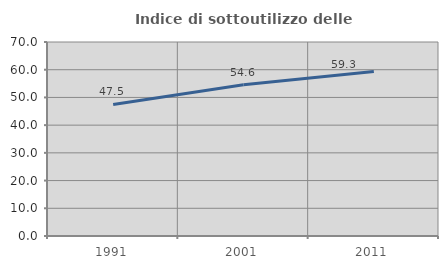
| Category | Indice di sottoutilizzo delle abitazioni  |
|---|---|
| 1991.0 | 47.458 |
| 2001.0 | 54.595 |
| 2011.0 | 59.341 |